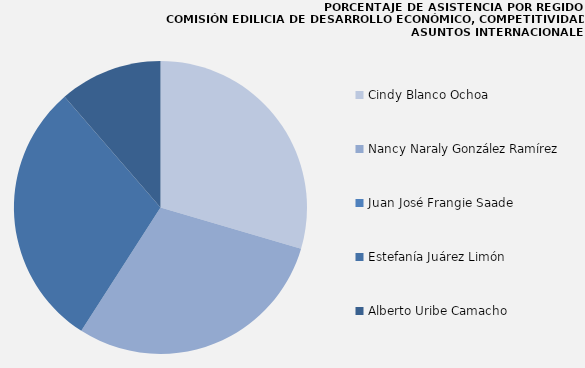
| Category | Series 0 |
|---|---|
| Cindy Blanco Ochoa | 100 |
| Nancy Naraly González Ramírez | 100 |
| Juan José Frangie Saade | 0 |
| Estefanía Juárez Limón | 100 |
| Alberto Uribe Camacho | 38.462 |